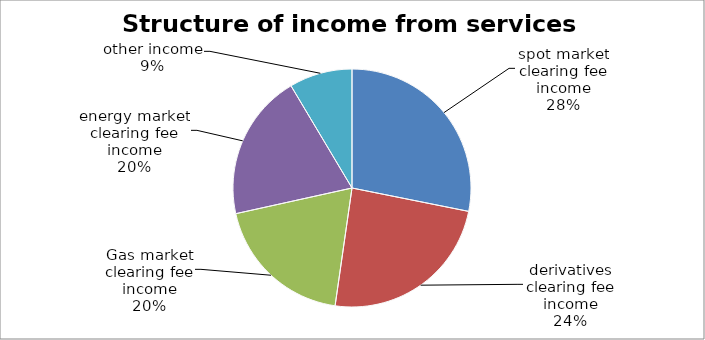
| Category | Series 0 |
|---|---|
| spot market clearing fee income | 277.3 |
| derivatives clearing fee income | 237.6 |
| Gas market clearing fee income | 189.8 |
| energy market clearing fee income | 196 |
| other income | 84.4 |